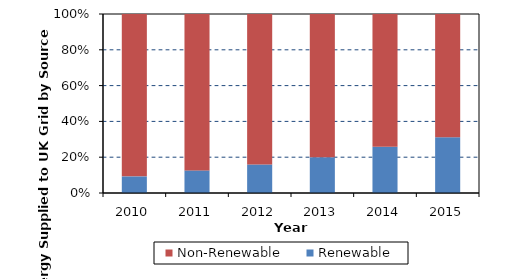
| Category | Renewable | Non-Renewable |
|---|---|---|
| 2010.0 | 3.874 | 37.8 |
| 2011.0 | 5.11 | 35.34 |
| 2012.0 | 6.45 | 34.01 |
| 2013.0 | 8.05 | 32.23 |
| 2014.0 | 10.01 | 28.81 |
| 2015.0 | 12.071 | 26.692 |